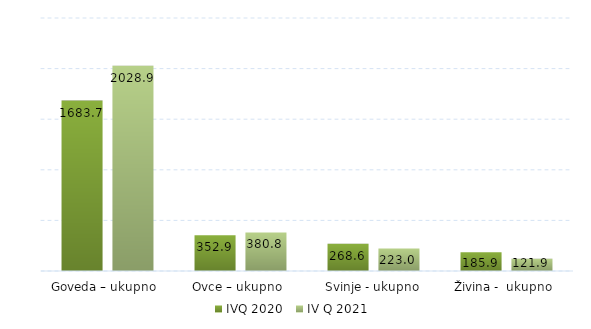
| Category | IVQ 2020 | IV Q 2021 |
|---|---|---|
| Goveda – ukupno  | 1683.694 | 2028.923 |
| Ovce – ukupno  | 352.9 | 380.8 |
| Svinje - ukupno | 268.6 | 223 |
| Živina -  ukupno  | 185.9 | 121.9 |